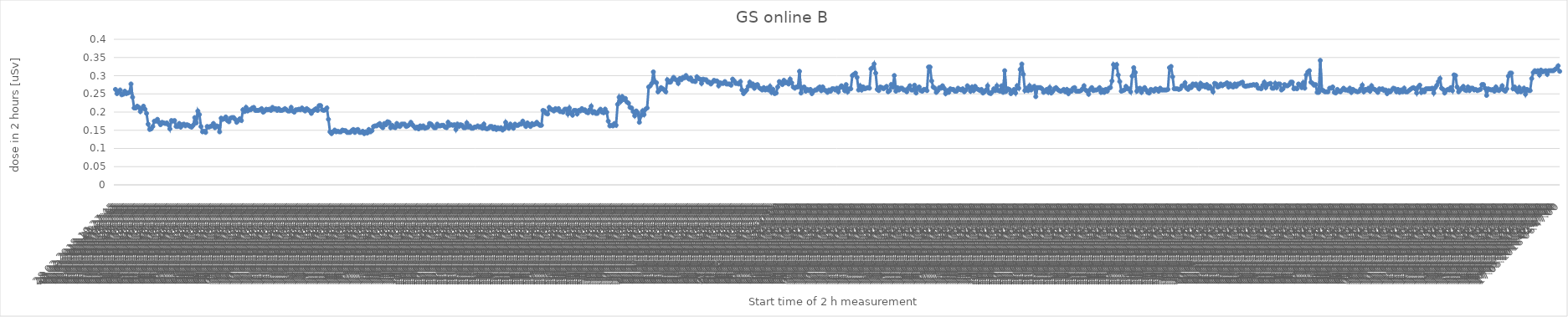
| Category | Series 0 |
|---|---|
| 28.02.2018 19:27:45 | 0.262 |
| 28.02.2018 21:27:45 | 0.251 |
| 28.02.2018 23:27:45 | 0.256 |
| 01.03.2018 01:27:45 | 0.261 |
| 01.03.2018 03:27:45 | 0.247 |
| 01.03.2018 05:27:45 | 0.249 |
| 01.03.2018 07:27:45 | 0.257 |
| 01.03.2018 09:27:45 | 0.251 |
| 01.03.2018 11:27:45 | 0.252 |
| 01.03.2018 13:27:45 | 0.254 |
| 01.03.2018 15:27:45 | 0.277 |
| 01.03.2018 17:27:45 | 0.241 |
| 01.03.2018 19:27:45 | 0.211 |
| 01.03.2018 21:27:45 | 0.211 |
| 01.03.2018 23:27:45 | 0.216 |
| 02.03.2018 01:27:45 | 0.213 |
| 02.03.2018 03:27:45 | 0.201 |
| 02.03.2018 05:27:45 | 0.21 |
| 02.03.2018 07:27:45 | 0.216 |
| 02.03.2018 09:27:45 | 0.208 |
| 02.03.2018 11:27:45 | 0.196 |
| 02.03.2018 13:27:45 | 0.167 |
| 02.03.2018 15:27:45 | 0.152 |
| 02.03.2018 17:27:45 | 0.154 |
| 02.03.2018 19:27:45 | 0.16 |
| 02.03.2018 21:27:45 | 0.175 |
| 02.03.2018 23:27:45 | 0.175 |
| 03.03.2018 01:27:45 | 0.18 |
| 03.03.2018 03:27:45 | 0.172 |
| 03.03.2018 05:27:45 | 0.165 |
| 03.03.2018 07:27:45 | 0.172 |
| 03.03.2018 09:27:45 | 0.17 |
| 03.03.2018 11:27:45 | 0.169 |
| 03.03.2018 13:27:45 | 0.17 |
| 03.03.2018 15:27:45 | 0.165 |
| 03.03.2018 17:27:45 | 0.154 |
| 03.03.2018 19:27:45 | 0.177 |
| 03.03.2018 21:27:45 | 0.175 |
| 03.03.2018 23:27:45 | 0.177 |
| 04.03.2018 01:27:45 | 0.16 |
| 04.03.2018 03:27:45 | 0.16 |
| 04.03.2018 05:27:45 | 0.169 |
| 04.03.2018 07:27:45 | 0.159 |
| 04.03.2018 09:27:45 | 0.165 |
| 04.03.2018 11:27:45 | 0.167 |
| 04.03.2018 13:27:45 | 0.162 |
| 04.03.2018 15:27:45 | 0.165 |
| 04.03.2018 17:27:45 | 0.164 |
| 04.03.2018 19:27:45 | 0.16 |
| 04.03.2018 21:27:45 | 0.159 |
| 04.03.2018 23:27:45 | 0.164 |
| 05.03.2018 01:27:45 | 0.185 |
| 05.03.2018 03:27:45 | 0.17 |
| 05.03.2018 05:27:45 | 0.203 |
| 05.03.2018 07:27:45 | 0.193 |
| 05.03.2018 09:27:45 | 0.16 |
| 05.03.2018 11:27:45 | 0.146 |
| 05.03.2018 13:27:45 | 0.147 |
| 05.03.2018 15:27:45 | 0.144 |
| 05.03.2018 17:27:45 | 0.16 |
| 05.03.2018 19:27:45 | 0.159 |
| 05.03.2018 21:27:45 | 0.16 |
| 05.03.2018 23:27:45 | 0.162 |
| 06.03.2018 01:27:45 | 0.169 |
| 06.03.2018 03:27:45 | 0.157 |
| 06.03.2018 05:27:45 | 0.162 |
| 06.03.2018 07:27:45 | 0.16 |
| 06.03.2018 09:27:45 | 0.146 |
| 06.03.2018 11:27:45 | 0.183 |
| 06.03.2018 13:27:45 | 0.18 |
| 06.03.2018 15:27:45 | 0.182 |
| 06.03.2018 17:27:45 | 0.187 |
| 06.03.2018 19:27:45 | 0.177 |
| 06.03.2018 21:27:45 | 0.173 |
| 06.03.2018 23:27:45 | 0.183 |
| 07.03.2018 01:27:45 | 0.185 |
| 07.03.2018 03:27:45 | 0.185 |
| 07.03.2018 05:27:45 | 0.18 |
| 07.03.2018 07:27:45 | 0.172 |
| 07.03.2018 09:27:45 | 0.177 |
| 07.03.2018 11:27:45 | 0.182 |
| 07.03.2018 13:27:45 | 0.177 |
| 07.03.2018 15:27:45 | 0.206 |
| 07.03.2018 17:27:45 | 0.201 |
| 07.03.2018 19:27:45 | 0.213 |
| 07.03.2018 21:27:45 | 0.203 |
| 07.03.2018 23:27:45 | 0.206 |
| 08.03.2018 01:27:45 | 0.206 |
| 08.03.2018 03:27:45 | 0.211 |
| 08.03.2018 05:27:45 | 0.213 |
| 08.03.2018 07:27:45 | 0.205 |
| 08.03.2018 09:27:45 | 0.205 |
| 08.03.2018 11:27:45 | 0.205 |
| 08.03.2018 13:27:45 | 0.206 |
| 08.03.2018 15:27:45 | 0.21 |
| 08.03.2018 17:27:45 | 0.2 |
| 08.03.2018 19:27:45 | 0.203 |
| 08.03.2018 21:27:45 | 0.208 |
| 08.03.2018 23:27:45 | 0.206 |
| 09.03.2018 01:27:45 | 0.208 |
| 09.03.2018 03:27:45 | 0.205 |
| 09.03.2018 05:27:45 | 0.213 |
| 09.03.2018 07:27:45 | 0.208 |
| 09.03.2018 09:27:45 | 0.21 |
| 09.03.2018 11:27:45 | 0.205 |
| 09.03.2018 13:27:45 | 0.21 |
| 09.03.2018 15:27:45 | 0.205 |
| 09.03.2018 17:27:45 | 0.205 |
| 09.03.2018 19:27:45 | 0.206 |
| 09.03.2018 21:27:45 | 0.21 |
| 09.03.2018 23:27:45 | 0.206 |
| 10.03.2018 01:27:45 | 0.203 |
| 10.03.2018 03:27:45 | 0.203 |
| 10.03.2018 05:27:45 | 0.213 |
| 10.03.2018 07:27:45 | 0.203 |
| 10.03.2018 09:27:45 | 0.2 |
| 10.03.2018 11:27:45 | 0.206 |
| 10.03.2018 13:27:45 | 0.206 |
| 10.03.2018 15:27:45 | 0.208 |
| 10.03.2018 17:27:45 | 0.206 |
| 10.03.2018 19:27:45 | 0.211 |
| 10.03.2018 21:27:45 | 0.206 |
| 10.03.2018 23:27:45 | 0.203 |
| 11.03.2018 01:27:45 | 0.21 |
| 11.03.2018 03:27:45 | 0.206 |
| 11.03.2018 05:27:45 | 0.203 |
| 11.03.2018 07:27:45 | 0.196 |
| 11.03.2018 09:27:45 | 0.203 |
| 11.03.2018 11:27:45 | 0.206 |
| 11.03.2018 13:27:45 | 0.21 |
| 11.03.2018 15:27:45 | 0.205 |
| 11.03.2018 17:27:45 | 0.218 |
| 11.03.2018 19:27:45 | 0.218 |
| 11.03.2018 21:27:45 | 0.206 |
| 11.03.2018 23:27:45 | 0.205 |
| 12.03.2018 01:27:45 | 0.206 |
| 12.03.2018 03:27:45 | 0.211 |
| 12.03.2018 05:27:45 | 0.18 |
| 12.03.2018 07:27:45 | 0.146 |
| 12.03.2018 09:27:45 | 0.141 |
| 12.03.2018 11:27:45 | 0.146 |
| 12.03.2018 13:27:45 | 0.151 |
| 12.03.2018 15:27:45 | 0.146 |
| 12.03.2018 17:27:45 | 0.147 |
| 12.03.2018 19:27:45 | 0.146 |
| 12.03.2018 21:27:45 | 0.146 |
| 12.03.2018 23:27:45 | 0.151 |
| 13.03.2018 01:27:45 | 0.149 |
| 13.03.2018 03:27:45 | 0.149 |
| 13.03.2018 05:27:45 | 0.144 |
| 13.03.2018 07:27:45 | 0.144 |
| 13.03.2018 09:27:45 | 0.144 |
| 13.03.2018 11:27:45 | 0.149 |
| 13.03.2018 13:27:45 | 0.152 |
| 13.03.2018 15:27:45 | 0.144 |
| 13.03.2018 17:27:45 | 0.151 |
| 13.03.2018 19:27:45 | 0.152 |
| 13.03.2018 21:27:45 | 0.144 |
| 13.03.2018 23:27:45 | 0.144 |
| 14.03.2018 01:27:45 | 0.147 |
| 14.03.2018 03:27:45 | 0.141 |
| 14.03.2018 05:27:45 | 0.146 |
| 14.03.2018 07:27:45 | 0.142 |
| 14.03.2018 09:27:45 | 0.152 |
| 14.03.2018 11:27:45 | 0.146 |
| 14.03.2018 13:27:45 | 0.149 |
| 14.03.2018 15:27:45 | 0.16 |
| 14.03.2018 17:27:45 | 0.162 |
| 14.03.2018 19:27:45 | 0.162 |
| 14.03.2018 21:27:45 | 0.165 |
| 14.03.2018 23:27:45 | 0.169 |
| 15.03.2018 01:27:45 | 0.16 |
| 15.03.2018 03:27:45 | 0.157 |
| 15.03.2018 05:27:45 | 0.169 |
| 15.03.2018 07:27:45 | 0.165 |
| 15.03.2018 09:27:45 | 0.173 |
| 15.03.2018 11:27:45 | 0.172 |
| 15.03.2018 13:27:45 | 0.157 |
| 15.03.2018 15:27:45 | 0.164 |
| 15.03.2018 17:27:45 | 0.159 |
| 15.03.2018 19:27:45 | 0.157 |
| 15.03.2018 21:27:45 | 0.169 |
| 15.03.2018 23:27:45 | 0.162 |
| 16.03.2018 01:27:45 | 0.16 |
| 16.03.2018 03:27:45 | 0.167 |
| 16.03.2018 05:27:45 | 0.167 |
| 16.03.2018 07:27:45 | 0.167 |
| 16.03.2018 09:27:45 | 0.16 |
| 16.03.2018 11:27:45 | 0.162 |
| 16.03.2018 13:27:45 | 0.165 |
| 16.03.2018 15:27:45 | 0.172 |
| 16.03.2018 17:27:45 | 0.165 |
| 16.03.2018 19:27:45 | 0.16 |
| 16.03.2018 21:27:45 | 0.155 |
| 16.03.2018 23:27:45 | 0.159 |
| 17.03.2018 01:27:45 | 0.154 |
| 17.03.2018 03:27:45 | 0.162 |
| 17.03.2018 05:27:45 | 0.157 |
| 17.03.2018 07:27:45 | 0.162 |
| 17.03.2018 09:27:45 | 0.155 |
| 17.03.2018 11:27:45 | 0.157 |
| 17.03.2018 13:27:45 | 0.159 |
| 17.03.2018 15:27:45 | 0.169 |
| 17.03.2018 17:27:45 | 0.167 |
| 17.03.2018 19:27:45 | 0.162 |
| 17.03.2018 21:27:45 | 0.157 |
| 17.03.2018 23:27:45 | 0.157 |
| 18.03.2018 01:27:45 | 0.167 |
| 18.03.2018 03:27:45 | 0.162 |
| 18.03.2018 05:27:45 | 0.162 |
| 18.03.2018 07:27:45 | 0.164 |
| 18.03.2018 09:27:45 | 0.164 |
| 18.03.2018 11:27:45 | 0.159 |
| 18.03.2018 13:27:45 | 0.157 |
| 18.03.2018 15:27:45 | 0.172 |
| 18.03.2018 17:27:45 | 0.164 |
| 18.03.2018 19:27:45 | 0.165 |
| 18.03.2018 21:27:45 | 0.164 |
| 18.03.2018 23:27:45 | 0.165 |
| 19.03.2018 01:27:45 | 0.152 |
| 19.03.2018 03:27:45 | 0.167 |
| 19.03.2018 05:27:45 | 0.16 |
| 19.03.2018 07:27:45 | 0.165 |
| 19.03.2018 09:27:45 | 0.164 |
| 19.03.2018 11:27:45 | 0.157 |
| 19.03.2018 13:27:45 | 0.157 |
| 19.03.2018 15:27:45 | 0.17 |
| 19.03.2018 17:27:45 | 0.159 |
| 19.03.2018 19:27:45 | 0.162 |
| 19.03.2018 21:27:45 | 0.155 |
| 19.03.2018 23:27:45 | 0.155 |
| 20.03.2018 01:27:45 | 0.159 |
| 20.03.2018 03:27:45 | 0.159 |
| 20.03.2018 05:27:45 | 0.162 |
| 20.03.2018 07:27:45 | 0.159 |
| 20.03.2018 09:27:45 | 0.16 |
| 20.03.2018 11:27:45 | 0.155 |
| 20.03.2018 13:27:45 | 0.167 |
| 20.03.2018 15:27:45 | 0.155 |
| 20.03.2018 17:27:45 | 0.154 |
| 20.03.2018 19:27:45 | 0.155 |
| 20.03.2018 21:27:45 | 0.16 |
| 20.03.2018 23:27:45 | 0.16 |
| 21.03.2018 01:27:45 | 0.154 |
| 21.03.2018 03:27:45 | 0.159 |
| 21.03.2018 05:27:45 | 0.152 |
| 21.03.2018 07:27:45 | 0.157 |
| 21.03.2018 09:27:45 | 0.154 |
| 21.03.2018 11:27:45 | 0.157 |
| 21.03.2018 13:27:45 | 0.151 |
| 21.03.2018 15:27:45 | 0.154 |
| 21.03.2018 17:27:45 | 0.172 |
| 21.03.2018 19:27:45 | 0.162 |
| 21.03.2018 21:27:45 | 0.155 |
| 21.03.2018 23:27:45 | 0.167 |
| 22.03.2018 01:27:45 | 0.16 |
| 22.03.2018 03:27:45 | 0.155 |
| 22.03.2018 05:27:45 | 0.167 |
| 22.03.2018 07:27:45 | 0.164 |
| 22.03.2018 09:27:45 | 0.164 |
| 22.03.2018 11:27:45 | 0.167 |
| 22.03.2018 13:27:45 | 0.167 |
| 22.03.2018 15:27:45 | 0.175 |
| 22.03.2018 17:27:45 | 0.167 |
| 22.03.2018 19:27:45 | 0.16 |
| 22.03.2018 21:27:45 | 0.17 |
| 22.03.2018 23:27:45 | 0.165 |
| 23.03.2018 01:27:45 | 0.16 |
| 23.03.2018 03:27:45 | 0.169 |
| 23.03.2018 05:27:45 | 0.165 |
| 23.03.2018 07:27:45 | 0.167 |
| 23.03.2018 09:27:45 | 0.172 |
| 23.03.2018 11:27:45 | 0.167 |
| 23.03.2018 13:27:45 | 0.164 |
| 23.03.2018 15:27:45 | 0.164 |
| 23.03.2018 17:27:45 | 0.205 |
| 23.03.2018 19:27:45 | 0.203 |
| 23.03.2018 21:27:45 | 0.196 |
| 23.03.2018 23:27:45 | 0.195 |
| 24.03.2018 01:27:45 | 0.213 |
| 24.03.2018 03:27:45 | 0.208 |
| 24.03.2018 05:27:45 | 0.206 |
| 24.03.2018 07:27:45 | 0.203 |
| 24.03.2018 09:27:45 | 0.21 |
| 24.03.2018 11:27:45 | 0.206 |
| 24.03.2018 13:27:45 | 0.21 |
| 24.03.2018 15:27:45 | 0.201 |
| 24.03.2018 17:27:45 | 0.201 |
| 24.03.2018 19:27:45 | 0.2 |
| 24.03.2018 21:27:45 | 0.208 |
| 24.03.2018 23:27:45 | 0.208 |
| 25.03.2018 01:27:45 | 0.195 |
| 25.03.2018 03:27:45 | 0.211 |
| 25.03.2018 05:27:45 | 0.198 |
| 25.03.2018 07:27:45 | 0.191 |
| 25.03.2018 09:27:45 | 0.205 |
| 25.03.2018 11:27:45 | 0.205 |
| 25.03.2018 13:27:45 | 0.195 |
| 25.03.2018 15:27:45 | 0.205 |
| 25.03.2018 17:27:45 | 0.203 |
| 25.03.2018 19:27:45 | 0.21 |
| 25.03.2018 21:27:45 | 0.205 |
| 25.03.2018 23:27:45 | 0.206 |
| 26.03.2018 01:27:45 | 0.2 |
| 26.03.2018 03:27:45 | 0.198 |
| 26.03.2018 05:27:45 | 0.206 |
| 26.03.2018 07:27:45 | 0.216 |
| 26.03.2018 09:27:45 | 0.198 |
| 26.03.2018 11:27:45 | 0.201 |
| 26.03.2018 13:27:45 | 0.196 |
| 26.03.2018 15:27:45 | 0.196 |
| 26.03.2018 17:27:45 | 0.203 |
| 26.03.2018 19:27:45 | 0.208 |
| 26.03.2018 21:27:45 | 0.2 |
| 26.03.2018 23:27:45 | 0.198 |
| 27.03.2018 01:27:45 | 0.208 |
| 27.03.2018 03:27:45 | 0.2 |
| 27.03.2018 05:27:45 | 0.175 |
| 27.03.2018 07:27:45 | 0.162 |
| 27.03.2018 09:27:45 | 0.164 |
| 27.03.2018 11:27:45 | 0.162 |
| 27.03.2018 13:27:45 | 0.169 |
| 27.03.2018 15:27:45 | 0.164 |
| 27.03.2018 17:27:45 | 0.221 |
| 27.03.2018 19:27:45 | 0.241 |
| 27.03.2018 21:27:45 | 0.229 |
| 27.03.2018 23:27:45 | 0.242 |
| 28.03.2018 01:27:45 | 0.234 |
| 28.03.2018 03:27:45 | 0.238 |
| 28.03.2018 05:27:45 | 0.228 |
| 28.03.2018 07:27:45 | 0.224 |
| 28.03.2018 09:27:45 | 0.213 |
| 28.03.2018 11:27:45 | 0.211 |
| 28.03.2018 13:27:45 | 0.201 |
| 28.03.2018 15:27:45 | 0.19 |
| 28.03.2018 17:27:45 | 0.203 |
| 28.03.2018 19:27:45 | 0.198 |
| 28.03.2018 21:27:45 | 0.172 |
| 28.03.2018 23:27:45 | 0.19 |
| 29.03.2018 01:27:45 | 0.203 |
| 29.03.2018 03:27:45 | 0.193 |
| 29.03.2018 05:27:45 | 0.208 |
| 29.03.2018 07:27:45 | 0.211 |
| 29.03.2018 09:27:45 | 0.269 |
| 29.03.2018 11:27:45 | 0.272 |
| 29.03.2018 13:27:45 | 0.279 |
| 29.03.2018 15:27:45 | 0.31 |
| 29.03.2018 17:27:45 | 0.284 |
| 29.03.2018 19:27:45 | 0.281 |
| 29.03.2018 21:27:45 | 0.256 |
| 29.03.2018 23:27:45 | 0.261 |
| 30.03.2018 01:27:45 | 0.267 |
| 30.03.2018 03:27:45 | 0.264 |
| 30.03.2018 05:27:45 | 0.261 |
| 30.03.2018 07:27:45 | 0.256 |
| 30.03.2018 09:27:45 | 0.289 |
| 30.03.2018 11:27:45 | 0.282 |
| 30.03.2018 13:27:45 | 0.282 |
| 30.03.2018 15:27:45 | 0.289 |
| 30.03.2018 17:27:45 | 0.295 |
| 30.03.2018 19:27:45 | 0.29 |
| 30.03.2018 21:27:45 | 0.287 |
| 30.03.2018 23:27:45 | 0.279 |
| 31.03.2018 01:27:45 | 0.292 |
| 31.03.2018 03:27:45 | 0.289 |
| 31.03.2018 05:27:45 | 0.295 |
| 31.03.2018 07:27:45 | 0.294 |
| 31.03.2018 09:27:45 | 0.3 |
| 31.03.2018 11:27:45 | 0.294 |
| 31.03.2018 13:27:45 | 0.29 |
| 31.03.2018 15:27:45 | 0.294 |
| 31.03.2018 17:27:45 | 0.286 |
| 31.03.2018 19:27:45 | 0.286 |
| 31.03.2018 21:27:45 | 0.284 |
| 31.03.2018 23:27:45 | 0.297 |
| 01.04.2018 01:27:45 | 0.292 |
| 01.04.2018 03:27:45 | 0.29 |
| 01.04.2018 05:27:45 | 0.279 |
| 01.04.2018 07:27:45 | 0.29 |
| 01.04.2018 09:27:45 | 0.289 |
| 01.04.2018 11:27:45 | 0.289 |
| 01.04.2018 13:27:45 | 0.282 |
| 01.04.2018 15:27:45 | 0.282 |
| 01.04.2018 17:27:45 | 0.277 |
| 01.04.2018 19:27:45 | 0.282 |
| 01.04.2018 21:27:45 | 0.287 |
| 01.04.2018 23:27:45 | 0.286 |
| 02.04.2018 01:27:45 | 0.286 |
| 02.04.2018 03:27:45 | 0.272 |
| 02.04.2018 05:27:45 | 0.281 |
| 02.04.2018 07:27:45 | 0.279 |
| 02.04.2018 09:27:45 | 0.279 |
| 02.04.2018 11:27:45 | 0.284 |
| 02.04.2018 13:27:45 | 0.277 |
| 02.04.2018 15:27:45 | 0.277 |
| 02.04.2018 17:27:45 | 0.277 |
| 02.04.2018 19:27:45 | 0.274 |
| 02.04.2018 21:27:45 | 0.29 |
| 02.04.2018 23:27:45 | 0.286 |
| 03.04.2018 01:27:45 | 0.279 |
| 03.04.2018 03:27:45 | 0.279 |
| 03.04.2018 05:27:45 | 0.277 |
| 03.04.2018 07:27:45 | 0.284 |
| 03.04.2018 09:27:45 | 0.261 |
| 03.04.2018 11:27:45 | 0.251 |
| 03.04.2018 13:27:45 | 0.256 |
| 03.04.2018 15:27:45 | 0.261 |
| 03.04.2018 17:27:45 | 0.271 |
| 03.04.2018 19:27:45 | 0.282 |
| 03.04.2018 21:27:45 | 0.272 |
| 03.04.2018 23:27:45 | 0.277 |
| 04.04.2018 01:27:45 | 0.266 |
| 04.04.2018 03:27:45 | 0.274 |
| 04.04.2018 05:27:45 | 0.276 |
| 04.04.2018 07:27:45 | 0.267 |
| 04.04.2018 09:27:45 | 0.264 |
| 04.04.2018 11:27:45 | 0.261 |
| 04.04.2018 13:27:45 | 0.267 |
| 04.04.2018 15:27:45 | 0.261 |
| 04.04.2018 17:27:45 | 0.266 |
| 04.04.2018 19:27:45 | 0.261 |
| 04.04.2018 21:27:45 | 0.271 |
| 04.04.2018 23:27:45 | 0.254 |
| 05.04.2018 01:27:45 | 0.262 |
| 05.04.2018 03:27:45 | 0.251 |
| 05.04.2018 05:27:45 | 0.252 |
| 05.04.2018 07:27:45 | 0.269 |
| 16.02.2018 12:00:00 | 0.284 |
| 05.04.2018 12:47:00 | 0.281 |
| 05.04.2018 14:47:00 | 0.276 |
| 05.04.2018 16:47:00 | 0.287 |
| 05.04.2018 18:47:00 | 0.281 |
| 05.04.2018 20:47:00 | 0.282 |
| 05.04.2018 22:47:00 | 0.277 |
| 06.04.2018 00:47:00 | 0.29 |
| 06.04.2018 02:47:00 | 0.281 |
| 06.04.2018 04:47:00 | 0.269 |
| 06.04.2018 06:47:00 | 0.266 |
| 06.04.2018 08:47:00 | 0.269 |
| 06.04.2018 10:47:00 | 0.269 |
| 06.04.2018 12:47:00 | 0.312 |
| 06.04.2018 14:47:00 | 0.252 |
| 06.04.2018 16:47:00 | 0.267 |
| 06.04.2018 18:47:00 | 0.269 |
| 06.04.2018 20:47:00 | 0.257 |
| 06.04.2018 22:47:00 | 0.262 |
| 07.04.2018 00:47:00 | 0.259 |
| 07.04.2018 02:47:00 | 0.262 |
| 07.04.2018 04:47:00 | 0.251 |
| 07.04.2018 06:47:00 | 0.257 |
| 07.04.2018 08:47:00 | 0.261 |
| 07.04.2018 10:47:00 | 0.261 |
| 07.04.2018 12:47:00 | 0.266 |
| 07.04.2018 14:47:00 | 0.269 |
| 07.04.2018 16:47:00 | 0.259 |
| 07.04.2018 18:47:00 | 0.269 |
| 07.04.2018 20:47:00 | 0.261 |
| 07.04.2018 22:47:00 | 0.259 |
| 08.04.2018 00:47:00 | 0.254 |
| 08.04.2018 02:47:00 | 0.261 |
| 08.04.2018 04:47:00 | 0.257 |
| 08.04.2018 06:47:00 | 0.264 |
| 08.04.2018 08:47:00 | 0.264 |
| 08.04.2018 10:47:00 | 0.261 |
| 08.04.2018 12:47:00 | 0.266 |
| 08.04.2018 14:47:00 | 0.256 |
| 08.04.2018 16:47:00 | 0.267 |
| 08.04.2018 18:47:00 | 0.272 |
| 08.04.2018 20:47:00 | 0.267 |
| 08.04.2018 22:47:00 | 0.259 |
| 09.04.2018 00:47:00 | 0.276 |
| 09.04.2018 02:47:00 | 0.256 |
| 09.04.2018 04:47:00 | 0.264 |
| 09.04.2018 06:47:00 | 0.264 |
| 09.04.2018 08:47:00 | 0.3 |
| 09.04.2018 10:47:00 | 0.304 |
| 09.04.2018 12:47:00 | 0.307 |
| 09.04.2018 14:47:00 | 0.295 |
| 09.04.2018 16:47:00 | 0.261 |
| 09.04.2018 18:47:00 | 0.272 |
| 09.04.2018 20:47:00 | 0.261 |
| 09.04.2018 22:47:00 | 0.269 |
| 10.04.2018 00:47:00 | 0.264 |
| 10.04.2018 02:47:00 | 0.266 |
| 10.04.2018 04:47:00 | 0.267 |
| 10.04.2018 06:47:00 | 0.266 |
| 10.04.2018 08:47:00 | 0.319 |
| 10.04.2018 10:47:00 | 0.322 |
| 10.04.2018 12:47:00 | 0.332 |
| 10.04.2018 14:47:00 | 0.307 |
| 10.04.2018 16:47:00 | 0.262 |
| 10.04.2018 18:47:00 | 0.259 |
| 10.04.2018 20:47:00 | 0.269 |
| 10.04.2018 22:47:00 | 0.267 |
| 11.04.2018 00:47:00 | 0.264 |
| 11.04.2018 02:47:00 | 0.267 |
| 11.04.2018 04:47:00 | 0.271 |
| 11.04.2018 06:47:00 | 0.256 |
| 11.04.2018 08:47:00 | 0.259 |
| 11.04.2018 10:47:00 | 0.276 |
| 11.04.2018 12:47:00 | 0.269 |
| 11.04.2018 14:47:00 | 0.3 |
| 11.04.2018 16:47:00 | 0.257 |
| 11.04.2018 18:47:00 | 0.267 |
| 11.04.2018 20:47:00 | 0.261 |
| 11.04.2018 22:47:00 | 0.266 |
| 12.04.2018 00:47:00 | 0.266 |
| 12.04.2018 02:47:00 | 0.261 |
| 12.04.2018 04:47:00 | 0.261 |
| 12.04.2018 06:47:00 | 0.256 |
| 12.04.2018 08:47:00 | 0.266 |
| 12.04.2018 10:47:00 | 0.272 |
| 12.04.2018 12:47:00 | 0.261 |
| 12.04.2018 14:47:00 | 0.261 |
| 12.04.2018 16:47:00 | 0.274 |
| 12.04.2018 18:47:00 | 0.252 |
| 12.04.2018 20:47:00 | 0.266 |
| 12.04.2018 22:47:00 | 0.269 |
| 13.04.2018 00:47:00 | 0.259 |
| 13.04.2018 02:47:00 | 0.257 |
| 13.04.2018 04:47:00 | 0.262 |
| 13.04.2018 06:47:00 | 0.262 |
| 13.04.2018 08:47:00 | 0.259 |
| 13.04.2018 10:47:00 | 0.324 |
| 13.04.2018 12:47:00 | 0.324 |
| 13.04.2018 14:47:00 | 0.286 |
| 13.04.2018 16:47:00 | 0.269 |
| 13.04.2018 18:47:00 | 0.266 |
| 13.04.2018 20:47:00 | 0.254 |
| 13.04.2018 22:47:00 | 0.259 |
| 14.04.2018 00:47:00 | 0.267 |
| 14.04.2018 02:47:00 | 0.266 |
| 14.04.2018 04:47:00 | 0.272 |
| 14.04.2018 06:47:00 | 0.266 |
| 14.04.2018 08:47:00 | 0.251 |
| 14.04.2018 10:47:00 | 0.259 |
| 14.04.2018 12:47:00 | 0.254 |
| 14.04.2018 14:47:00 | 0.264 |
| 14.04.2018 16:47:00 | 0.262 |
| 14.04.2018 18:47:00 | 0.262 |
| 14.04.2018 20:47:00 | 0.257 |
| 14.04.2018 22:47:00 | 0.257 |
| 15.04.2018 00:47:00 | 0.266 |
| 15.04.2018 02:47:00 | 0.262 |
| 15.04.2018 04:47:00 | 0.261 |
| 15.04.2018 06:47:00 | 0.264 |
| 15.04.2018 08:47:00 | 0.256 |
| 15.04.2018 10:47:00 | 0.261 |
| 15.04.2018 12:47:00 | 0.272 |
| 15.04.2018 14:47:00 | 0.267 |
| 15.04.2018 16:47:00 | 0.257 |
| 15.04.2018 18:47:00 | 0.269 |
| 15.04.2018 20:47:00 | 0.259 |
| 15.04.2018 22:47:00 | 0.271 |
| 16.04.2018 00:47:00 | 0.264 |
| 16.04.2018 02:47:00 | 0.262 |
| 16.04.2018 04:47:00 | 0.259 |
| 16.04.2018 06:47:00 | 0.262 |
| 16.04.2018 08:47:00 | 0.252 |
| 16.04.2018 10:47:00 | 0.256 |
| 16.04.2018 12:47:00 | 0.261 |
| 16.04.2018 14:47:00 | 0.272 |
| 16.04.2018 16:47:00 | 0.252 |
| 16.04.2018 18:47:00 | 0.251 |
| 16.04.2018 20:47:00 | 0.256 |
| 16.04.2018 22:47:00 | 0.264 |
| 17.04.2018 00:47:00 | 0.259 |
| 17.04.2018 02:47:00 | 0.272 |
| 17.04.2018 04:47:00 | 0.259 |
| 17.04.2018 06:47:00 | 0.257 |
| 17.04.2018 08:47:00 | 0.272 |
| 17.04.2018 10:47:00 | 0.254 |
| 17.04.2018 12:47:00 | 0.314 |
| 17.04.2018 14:47:00 | 0.257 |
| 17.04.2018 16:47:00 | 0.264 |
| 17.04.2018 18:47:00 | 0.262 |
| 17.04.2018 20:47:00 | 0.251 |
| 17.04.2018 22:47:00 | 0.256 |
| 18.04.2018 00:47:00 | 0.262 |
| 18.04.2018 02:47:00 | 0.252 |
| 18.04.2018 04:47:00 | 0.272 |
| 18.04.2018 06:47:00 | 0.266 |
| 18.04.2018 08:47:00 | 0.317 |
| 18.04.2018 10:47:00 | 0.332 |
| 18.04.2018 12:47:00 | 0.304 |
| 18.04.2018 14:47:00 | 0.259 |
| 18.04.2018 16:47:00 | 0.266 |
| 18.04.2018 18:47:00 | 0.259 |
| 18.04.2018 20:47:00 | 0.272 |
| 18.04.2018 22:47:00 | 0.261 |
| 19.04.2018 00:47:00 | 0.266 |
| 19.04.2018 02:47:00 | 0.271 |
| 19.04.2018 04:47:00 | 0.242 |
| 19.04.2018 06:47:00 | 0.267 |
| 19.04.2018 08:47:00 | 0.267 |
| 19.04.2018 10:47:00 | 0.267 |
| 19.04.2018 12:47:00 | 0.264 |
| 19.04.2018 14:47:00 | 0.254 |
| 19.04.2018 16:47:00 | 0.257 |
| 19.04.2018 18:47:00 | 0.262 |
| 19.04.2018 20:47:00 | 0.254 |
| 19.04.2018 22:47:00 | 0.267 |
| 20.04.2018 00:47:00 | 0.252 |
| 20.04.2018 02:47:00 | 0.257 |
| 20.04.2018 04:47:00 | 0.264 |
| 20.04.2018 06:47:00 | 0.267 |
| 20.04.2018 08:47:00 | 0.262 |
| 20.04.2018 10:47:00 | 0.259 |
| 20.04.2018 12:47:00 | 0.257 |
| 20.04.2018 14:47:00 | 0.259 |
| 20.04.2018 16:47:00 | 0.262 |
| 20.04.2018 18:47:00 | 0.256 |
| 20.04.2018 20:47:00 | 0.262 |
| 20.04.2018 22:47:00 | 0.251 |
| 21.04.2018 00:47:00 | 0.259 |
| 21.04.2018 02:47:00 | 0.257 |
| 21.04.2018 04:47:00 | 0.266 |
| 21.04.2018 06:47:00 | 0.267 |
| 21.04.2018 08:47:00 | 0.257 |
| 21.04.2018 10:47:00 | 0.257 |
| 21.04.2018 12:47:00 | 0.257 |
| 21.04.2018 14:47:00 | 0.259 |
| 21.04.2018 16:47:00 | 0.264 |
| 21.04.2018 18:47:00 | 0.272 |
| 21.04.2018 20:47:00 | 0.261 |
| 21.04.2018 22:47:00 | 0.257 |
| 22.04.2018 00:47:00 | 0.249 |
| 22.04.2018 02:47:00 | 0.262 |
| 22.04.2018 04:47:00 | 0.267 |
| 22.04.2018 06:47:00 | 0.259 |
| 22.04.2018 08:47:00 | 0.261 |
| 22.04.2018 10:47:00 | 0.261 |
| 22.04.2018 12:47:00 | 0.262 |
| 22.04.2018 14:47:00 | 0.267 |
| 22.04.2018 16:47:00 | 0.254 |
| 22.04.2018 18:47:00 | 0.261 |
| 22.04.2018 20:47:00 | 0.254 |
| 22.04.2018 22:47:00 | 0.262 |
| 23.04.2018 00:47:00 | 0.257 |
| 23.04.2018 02:47:00 | 0.266 |
| 23.04.2018 04:47:00 | 0.267 |
| 23.04.2018 06:47:00 | 0.286 |
| 23.04.2018 08:47:00 | 0.33 |
| 23.04.2018 10:47:00 | 0.324 |
| 23.04.2018 12:47:00 | 0.33 |
| 23.04.2018 14:47:00 | 0.302 |
| 23.04.2018 16:47:00 | 0.284 |
| 23.04.2018 18:47:00 | 0.257 |
| 23.04.2018 20:47:00 | 0.259 |
| 23.04.2018 22:47:00 | 0.261 |
| 24.04.2018 00:47:00 | 0.271 |
| 24.04.2018 02:47:00 | 0.264 |
| 24.04.2018 04:47:00 | 0.264 |
| 24.04.2018 06:47:00 | 0.256 |
| 24.04.2018 08:47:00 | 0.299 |
| 24.04.2018 10:47:00 | 0.322 |
| 24.04.2018 12:47:00 | 0.309 |
| 24.04.2018 14:47:00 | 0.257 |
| 24.04.2018 16:47:00 | 0.264 |
| 24.04.2018 18:47:00 | 0.266 |
| 24.04.2018 20:47:00 | 0.254 |
| 24.04.2018 22:47:00 | 0.262 |
| 25.04.2018 00:47:00 | 0.267 |
| 25.04.2018 02:47:00 | 0.261 |
| 25.04.2018 04:47:00 | 0.254 |
| 25.04.2018 06:47:00 | 0.252 |
| 25.04.2018 08:47:00 | 0.262 |
| 25.04.2018 10:47:00 | 0.261 |
| 25.04.2018 12:47:00 | 0.257 |
| 25.04.2018 14:47:00 | 0.264 |
| 25.04.2018 16:47:00 | 0.262 |
| 25.04.2018 18:47:00 | 0.257 |
| 25.04.2018 20:47:00 | 0.266 |
| 25.04.2018 22:47:00 | 0.261 |
| 26.04.2018 00:47:00 | 0.261 |
| 26.04.2018 02:47:00 | 0.261 |
| 26.04.2018 04:47:00 | 0.261 |
| 26.04.2018 06:47:00 | 0.262 |
| 26.04.2018 08:47:00 | 0.322 |
| 26.04.2018 10:47:00 | 0.325 |
| 26.04.2018 12:47:00 | 0.297 |
| 26.04.2018 14:47:00 | 0.264 |
| 26.04.2018 16:47:00 | 0.264 |
| 26.04.2018 18:47:00 | 0.264 |
| 26.04.2018 20:47:00 | 0.262 |
| 26.04.2018 22:47:00 | 0.264 |
| 27.04.2018 00:47:00 | 0.272 |
| 27.04.2018 02:47:00 | 0.272 |
| 27.04.2018 04:47:00 | 0.281 |
| 27.04.2018 06:47:00 | 0.266 |
| 27.04.2018 08:47:00 | 0.262 |
| 27.04.2018 10:47:00 | 0.271 |
| 27.04.2018 12:47:00 | 0.267 |
| 27.04.2018 14:47:00 | 0.277 |
| 27.04.2018 16:47:00 | 0.274 |
| 27.04.2018 18:47:00 | 0.277 |
| 27.04.2018 20:47:00 | 0.271 |
| 27.04.2018 22:47:00 | 0.264 |
| 28.04.2018 00:47:00 | 0.279 |
| 28.04.2018 02:47:00 | 0.271 |
| 28.04.2018 04:47:00 | 0.274 |
| 28.04.2018 06:47:00 | 0.269 |
| 28.04.2018 08:47:00 | 0.276 |
| 28.04.2018 10:47:00 | 0.266 |
| 28.04.2018 12:47:00 | 0.271 |
| 28.04.2018 14:47:00 | 0.264 |
| 28.04.2018 16:47:00 | 0.256 |
| 28.04.2018 18:47:00 | 0.279 |
| 28.04.2018 20:47:00 | 0.277 |
| 28.04.2018 22:47:00 | 0.269 |
| 29.04.2018 00:47:00 | 0.271 |
| 29.04.2018 02:47:00 | 0.277 |
| 29.04.2018 04:47:00 | 0.272 |
| 29.04.2018 06:47:00 | 0.276 |
| 29.04.2018 08:47:00 | 0.277 |
| 29.04.2018 10:47:00 | 0.281 |
| 29.04.2018 12:47:00 | 0.269 |
| 29.04.2018 14:47:00 | 0.277 |
| 29.04.2018 16:47:00 | 0.271 |
| 29.04.2018 18:47:00 | 0.269 |
| 29.04.2018 20:47:00 | 0.277 |
| 29.04.2018 22:47:00 | 0.271 |
| 30.04.2018 00:47:00 | 0.277 |
| 30.04.2018 02:47:00 | 0.277 |
| 30.04.2018 04:47:00 | 0.281 |
| 30.04.2018 06:47:00 | 0.282 |
| 30.04.2018 08:47:00 | 0.272 |
| 30.04.2018 10:47:00 | 0.271 |
| 30.04.2018 12:47:00 | 0.272 |
| 30.04.2018 14:47:00 | 0.272 |
| 30.04.2018 16:47:00 | 0.274 |
| 30.04.2018 18:47:00 | 0.274 |
| 30.04.2018 20:47:00 | 0.276 |
| 30.04.2018 22:47:00 | 0.274 |
| 01.05.2018 00:47:00 | 0.276 |
| 01.05.2018 02:47:00 | 0.266 |
| 01.05.2018 04:47:00 | 0.266 |
| 01.05.2018 06:47:00 | 0.264 |
| 01.05.2018 08:47:00 | 0.274 |
| 01.05.2018 10:47:00 | 0.282 |
| 01.05.2018 12:47:00 | 0.267 |
| 01.05.2018 14:47:00 | 0.276 |
| 01.05.2018 16:47:00 | 0.277 |
| 01.05.2018 18:47:00 | 0.279 |
| 01.05.2018 20:47:00 | 0.266 |
| 01.05.2018 22:47:00 | 0.266 |
| 02.05.2018 00:47:00 | 0.279 |
| 02.05.2018 02:47:00 | 0.267 |
| 02.05.2018 04:47:00 | 0.277 |
| 02.05.2018 06:47:00 | 0.277 |
| 02.05.2018 08:47:00 | 0.261 |
| 02.05.2018 10:47:00 | 0.264 |
| 02.05.2018 12:47:00 | 0.276 |
| 02.05.2018 14:47:00 | 0.272 |
| 02.05.2018 16:47:00 | 0.272 |
| 02.05.2018 18:47:00 | 0.276 |
| 02.05.2018 20:47:00 | 0.282 |
| 02.05.2018 22:47:00 | 0.282 |
| 03.05.2018 00:47:00 | 0.264 |
| 03.05.2018 02:47:00 | 0.266 |
| 03.05.2018 04:47:00 | 0.264 |
| 03.05.2018 06:47:00 | 0.277 |
| 03.05.2018 08:47:00 | 0.274 |
| 03.05.2018 10:47:00 | 0.267 |
| 03.05.2018 12:47:00 | 0.281 |
| 03.05.2018 14:47:00 | 0.266 |
| 03.05.2018 16:47:00 | 0.302 |
| 03.05.2018 18:47:00 | 0.31 |
| 03.05.2018 20:47:00 | 0.314 |
| 03.05.2018 22:47:00 | 0.282 |
| 04.05.2018 00:47:00 | 0.279 |
| 04.05.2018 02:47:00 | 0.274 |
| 04.05.2018 04:47:00 | 0.276 |
| 04.05.2018 06:47:00 | 0.254 |
| 04.05.2018 08:47:00 | 0.254 |
| 04.05.2018 10:47:00 | 0.342 |
| 04.05.2018 12:47:00 | 0.261 |
| 04.05.2018 14:47:00 | 0.259 |
| 04.05.2018 16:47:00 | 0.256 |
| 04.05.2018 18:47:00 | 0.256 |
| 04.05.2018 20:47:00 | 0.256 |
| 04.05.2018 22:47:00 | 0.266 |
| 05.05.2018 00:47:00 | 0.266 |
| 05.05.2018 02:47:00 | 0.269 |
| 05.05.2018 04:47:00 | 0.254 |
| 05.05.2018 06:47:00 | 0.252 |
| 05.05.2018 08:47:00 | 0.262 |
| 05.05.2018 10:47:00 | 0.257 |
| 05.05.2018 12:47:00 | 0.256 |
| 05.05.2018 14:47:00 | 0.261 |
| 05.05.2018 16:47:00 | 0.266 |
| 05.05.2018 18:47:00 | 0.261 |
| 05.05.2018 20:47:00 | 0.261 |
| 05.05.2018 22:47:00 | 0.259 |
| 06.05.2018 00:47:00 | 0.266 |
| 06.05.2018 02:47:00 | 0.254 |
| 06.05.2018 04:47:00 | 0.262 |
| 06.05.2018 06:47:00 | 0.259 |
| 06.05.2018 08:47:00 | 0.257 |
| 06.05.2018 10:47:00 | 0.256 |
| 06.05.2018 12:47:00 | 0.257 |
| 06.05.2018 14:47:00 | 0.264 |
| 06.05.2018 16:47:00 | 0.274 |
| 06.05.2018 18:47:00 | 0.256 |
| 06.05.2018 20:47:00 | 0.262 |
| 06.05.2018 22:47:00 | 0.261 |
| 07.05.2018 00:47:00 | 0.266 |
| 07.05.2018 02:47:00 | 0.257 |
| 07.05.2018 04:47:00 | 0.272 |
| 07.05.2018 06:47:00 | 0.264 |
| 07.05.2018 08:47:00 | 0.262 |
| 07.05.2018 10:47:00 | 0.259 |
| 07.05.2018 12:47:00 | 0.254 |
| 07.05.2018 14:47:00 | 0.264 |
| 07.05.2018 16:47:00 | 0.262 |
| 07.05.2018 18:47:00 | 0.264 |
| 07.05.2018 20:47:00 | 0.259 |
| 07.05.2018 22:47:00 | 0.261 |
| 08.05.2018 00:47:00 | 0.251 |
| 08.05.2018 02:47:00 | 0.259 |
| 08.05.2018 04:47:00 | 0.256 |
| 08.05.2018 06:47:00 | 0.261 |
| 08.05.2018 08:47:00 | 0.266 |
| 08.05.2018 10:47:00 | 0.264 |
| 08.05.2018 12:47:00 | 0.256 |
| 08.05.2018 14:47:00 | 0.262 |
| 08.05.2018 16:47:00 | 0.254 |
| 08.05.2018 18:47:00 | 0.261 |
| 08.05.2018 20:47:00 | 0.256 |
| 08.05.2018 22:47:00 | 0.266 |
| 09.05.2018 00:47:00 | 0.256 |
| 09.05.2018 02:47:00 | 0.256 |
| 09.05.2018 04:47:00 | 0.259 |
| 09.05.2018 06:47:00 | 0.262 |
| 09.05.2018 08:47:00 | 0.266 |
| 09.05.2018 10:47:00 | 0.267 |
| 09.05.2018 12:47:00 | 0.264 |
| 09.05.2018 14:47:00 | 0.252 |
| 09.05.2018 16:47:00 | 0.269 |
| 09.05.2018 18:47:00 | 0.274 |
| 09.05.2018 20:47:00 | 0.254 |
| 09.05.2018 22:47:00 | 0.261 |
| 10.05.2018 00:47:00 | 0.256 |
| 10.05.2018 02:47:00 | 0.264 |
| 10.05.2018 04:47:00 | 0.264 |
| 10.05.2018 06:47:00 | 0.264 |
| 10.05.2018 08:47:00 | 0.264 |
| 10.05.2018 10:47:00 | 0.266 |
| 10.05.2018 12:47:00 | 0.252 |
| 10.05.2018 14:47:00 | 0.267 |
| 10.05.2018 16:47:00 | 0.274 |
| 10.05.2018 18:47:00 | 0.284 |
| 10.05.2018 20:47:00 | 0.292 |
| 10.05.2018 22:47:00 | 0.266 |
| 11.05.2018 00:47:00 | 0.262 |
| 11.05.2018 02:47:00 | 0.252 |
| 11.05.2018 04:47:00 | 0.259 |
| 11.05.2018 06:47:00 | 0.262 |
| 11.05.2018 08:47:00 | 0.261 |
| 11.05.2018 10:47:00 | 0.267 |
| 11.05.2018 12:47:00 | 0.259 |
| 11.05.2018 14:47:00 | 0.302 |
| 11.05.2018 16:47:00 | 0.3 |
| 11.05.2018 18:47:00 | 0.269 |
| 11.05.2018 20:47:00 | 0.256 |
| 11.05.2018 22:47:00 | 0.261 |
| 12.05.2018 00:47:00 | 0.266 |
| 12.05.2018 02:47:00 | 0.271 |
| 12.05.2018 04:47:00 | 0.261 |
| 12.05.2018 06:47:00 | 0.259 |
| 12.05.2018 08:47:00 | 0.269 |
| 12.05.2018 10:47:00 | 0.259 |
| 12.05.2018 12:47:00 | 0.266 |
| 12.05.2018 14:47:00 | 0.266 |
| 12.05.2018 16:47:00 | 0.261 |
| 12.05.2018 18:47:00 | 0.262 |
| 12.05.2018 20:47:00 | 0.259 |
| 12.05.2018 22:47:00 | 0.261 |
| 13.05.2018 00:47:00 | 0.262 |
| 13.05.2018 02:47:00 | 0.276 |
| 13.05.2018 04:47:00 | 0.276 |
| 13.05.2018 06:47:00 | 0.266 |
| 13.05.2018 08:47:00 | 0.246 |
| 13.05.2018 10:47:00 | 0.264 |
| 13.05.2018 12:47:00 | 0.262 |
| 13.05.2018 14:47:00 | 0.261 |
| 13.05.2018 16:47:00 | 0.262 |
| 13.05.2018 18:47:00 | 0.257 |
| 13.05.2018 20:47:00 | 0.269 |
| 13.05.2018 22:47:00 | 0.261 |
| 14.05.2018 00:47:00 | 0.259 |
| 14.05.2018 02:47:00 | 0.264 |
| 14.05.2018 04:47:00 | 0.272 |
| 14.05.2018 06:47:00 | 0.261 |
| 14.05.2018 08:47:00 | 0.257 |
| 14.05.2018 10:47:00 | 0.264 |
| 14.05.2018 12:47:00 | 0.299 |
| 14.05.2018 14:47:00 | 0.307 |
| 14.05.2018 16:47:00 | 0.307 |
| 14.05.2018 18:47:00 | 0.264 |
| 14.05.2018 20:47:00 | 0.269 |
| 14.05.2018 22:47:00 | 0.261 |
| 15.05.2018 00:47:00 | 0.256 |
| 15.05.2018 02:47:00 | 0.267 |
| 15.05.2018 04:47:00 | 0.256 |
| 15.05.2018 06:47:00 | 0.259 |
| 15.05.2018 08:47:00 | 0.266 |
| 15.05.2018 10:47:00 | 0.249 |
| 15.05.2018 12:47:00 | 0.262 |
| 15.05.2018 14:47:00 | 0.259 |
| 15.05.2018 16:47:00 | 0.259 |
| 15.05.2018 18:47:00 | 0.292 |
| 15.05.2018 20:47:00 | 0.309 |
| 15.05.2018 22:47:00 | 0.314 |
| 16.05.2018 00:47:00 | 0.31 |
| 16.05.2018 02:47:00 | 0.314 |
| 16.05.2018 04:47:00 | 0.302 |
| 16.05.2018 06:47:00 | 0.315 |
| 16.05.2018 08:47:00 | 0.31 |
| 16.05.2018 10:47:00 | 0.312 |
| 16.05.2018 12:47:00 | 0.314 |
| 16.05.2018 14:47:00 | 0.304 |
| 16.05.2018 16:47:00 | 0.314 |
| 16.05.2018 18:47:00 | 0.314 |
| 16.05.2018 20:47:00 | 0.314 |
| 16.05.2018 22:47:00 | 0.314 |
| 17.05.2018 00:47:00 | 0.317 |
| 17.05.2018 02:47:00 | 0.32 |
| 17.05.2018 04:47:00 | 0.327 |
| 17.05.2018 06:47:00 | 0.312 |